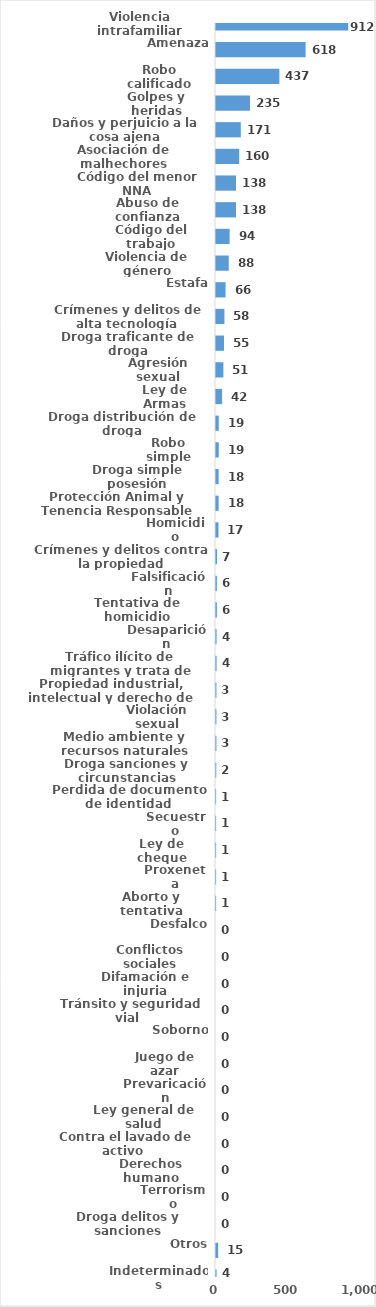
| Category | Series 0 |
|---|---|
| Violencia intrafamiliar | 912 |
| Amenaza | 618 |
| Robo calificado | 437 |
| Golpes y heridas | 235 |
| Daños y perjuicio a la cosa ajena | 171 |
| Asociación de malhechores | 160 |
| Código del menor NNA | 138 |
| Abuso de confianza | 138 |
| Código del trabajo | 94 |
| Violencia de género | 88 |
| Estafa | 66 |
| Crímenes y delitos de alta tecnología | 58 |
| Droga traficante de droga | 55 |
| Agresión sexual | 51 |
| Ley de Armas | 42 |
| Droga distribución de droga | 19 |
| Robo simple | 19 |
| Droga simple posesión | 18 |
| Protección Animal y Tenencia Responsable | 18 |
| Homicidio | 17 |
| Crímenes y delitos contra la propiedad | 7 |
| Falsificación | 6 |
| Tentativa de homicidio | 6 |
| Desaparición | 4 |
| Tráfico ilícito de migrantes y trata de personas | 4 |
| Propiedad industrial, intelectual y derecho de autor | 3 |
| Violación sexual | 3 |
| Medio ambiente y recursos naturales | 3 |
| Droga sanciones y circunstancias agravantes | 2 |
| Perdida de documento de identidad | 1 |
| Secuestro | 1 |
| Ley de cheque | 1 |
| Proxeneta | 1 |
| Aborto y tentativa | 1 |
| Desfalco | 0 |
| Conflictos sociales | 0 |
| Difamación e injuria | 0 |
| Tránsito y seguridad vial  | 0 |
| Soborno | 0 |
| Juego de azar | 0 |
| Prevaricación | 0 |
| Ley general de salud | 0 |
| Contra el lavado de activo  | 0 |
| Derechos humano | 0 |
| Terrorismo | 0 |
| Droga delitos y sanciones | 0 |
| Otros | 15 |
| Indeterminados | 4 |